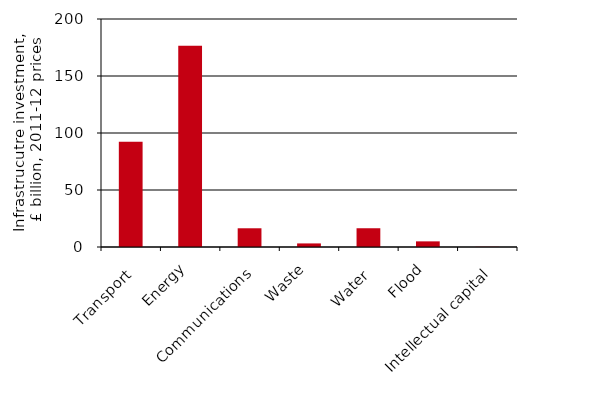
| Category | Infrastructure investment, £ billion, 2011-12 prices |
|---|---|
| 
Transport | 92300.873 |
| Energy | 176483.657 |
| 
Communications | 16419.758 |
| Waste | 3141.576 |
| 
Water | 16446.542 |
| Flood | 4944.503 |
| 
Intellectual capital | 185.536 |